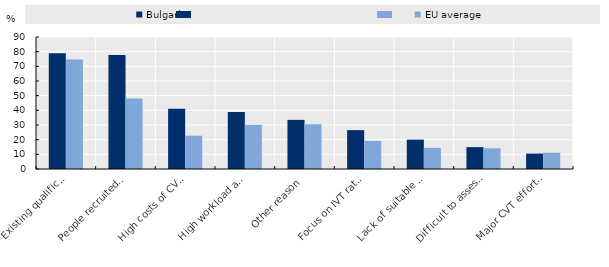
| Category | Bulgaria | EU average |
|---|---|---|
| Existing qualifications, skills and competences corresponded to the current needs of the enterprise | 78.9 | 74.7 |
| People recruited with the skills needed | 77.7 | 48.1 |
| High costs of CVT courses | 41 | 22.7 |
| High workload and limited / no time available for staff to participate in CVT | 38.9 | 30.1 |
| Other reason | 33.5 | 30.5 |
| Focus on IVT rather than on CVT | 26.5 | 19.2 |
| Lack of suitable CVT courses in the market | 20 | 14.4 |
| Difficult to assess enterprise's training needs | 14.9 | 14.1 |
| Major CVT efforts made in recent years | 10.5 | 11.1 |